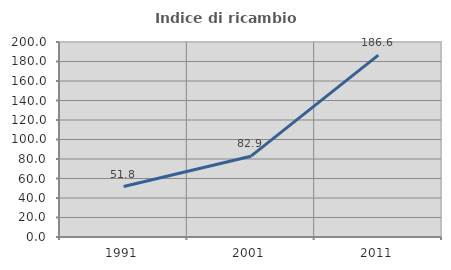
| Category | Indice di ricambio occupazionale  |
|---|---|
| 1991.0 | 51.761 |
| 2001.0 | 82.886 |
| 2011.0 | 186.598 |